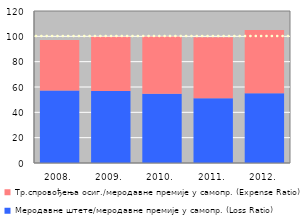
| Category | Меродавне штете/меродавне премије у самопр. (Loss Ratio) | Тр.спровођења осиг./меродавне премије у самопр. (Expense Ratio) |
|---|---|---|
| 2008. | 57.27 | 39.84 |
| 2009. | 56.9 | 42.71 |
| 2010. | 54.72 | 45.23 |
| 2011. | 51.18 | 48.09 |
| 2012. | 54.97 | 50.12 |